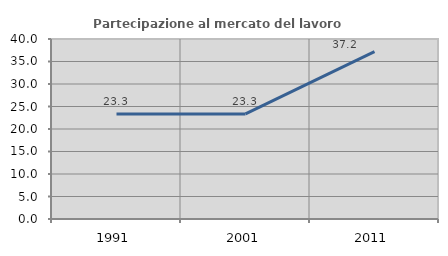
| Category | Partecipazione al mercato del lavoro  femminile |
|---|---|
| 1991.0 | 23.321 |
| 2001.0 | 23.346 |
| 2011.0 | 37.178 |